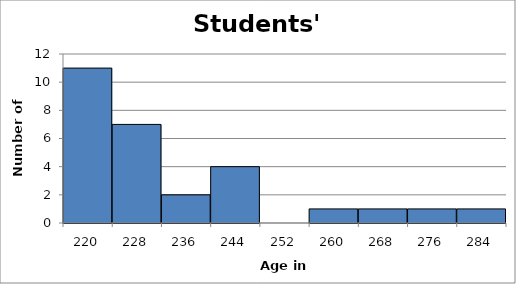
| Category | Series 0 |
|---|---|
| 220.0 | 11 |
| 228.0 | 7 |
| 236.0 | 2 |
| 244.0 | 4 |
| 252.0 | 0 |
| 260.0 | 1 |
| 268.0 | 1 |
| 276.0 | 1 |
| 284.0 | 1 |